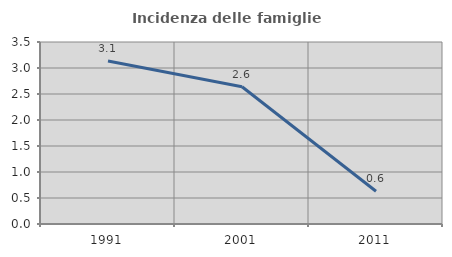
| Category | Incidenza delle famiglie numerose |
|---|---|
| 1991.0 | 3.134 |
| 2001.0 | 2.64 |
| 2011.0 | 0.629 |